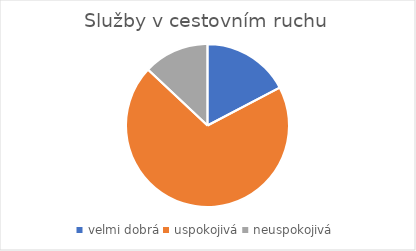
| Category | Služby v cestovním ruchu |
|---|---|
| velmi dobrá | 44 |
| uspokojivá | 177 |
| neuspokojivá | 33 |